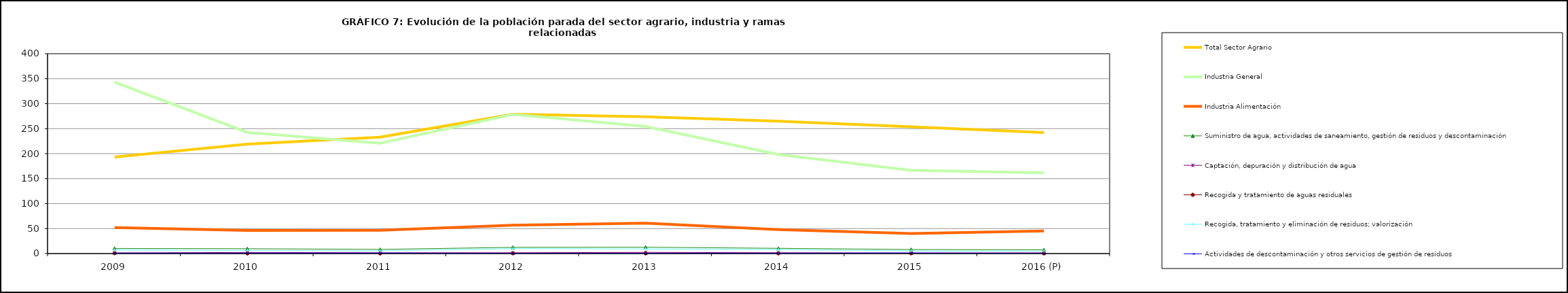
| Category | Total Sector Agrario | Industria General | Industria Alimentación | Suministro de agua, actividades de saneamiento, gestión de residuos y descontaminación  | Captación, depuración y distribución de agua         | Recogida y tratamiento de aguas residuales                                                                                 | Recogida, tratamiento y eliminación de residuos; valorización       | Actividades de descontaminación y otros servicios de gestión de residuos  |
|---|---|---|---|---|---|---|---|---|
| 2009 | 193.25 | 343.025 | 52 | 10.275 | 1.275 | 0.825 | 7.225 | 0.95 |
| 2010 | 218.925 | 242.575 | 46.15 | 9.725 | 2.25 | 0.225 | 6.475 | 0.8 |
| 2011 | 233.075 | 220.925 | 46.525 | 8.375 | 1.675 | 0.325 | 5.45 | 0.85 |
| 2012 | 278.9 | 278.675 | 56.8 | 12.475 | 1.6 | 0.5 | 9.975 | 0.45 |
| 2013 | 273.925 | 254.3 | 60.8 | 12.7 | 2.4 | 0.3 | 9.3 | 0.6 |
| 2014 | 265.1 | 198.3 | 47.85 | 10.5 | 1.6 | 0.4 | 7.9 | 0.8 |
| 2015 | 253.575 | 166.725 | 40.1 | 8.1 | 1.3 | 0.5 | 5.3 | 1 |
| 2016 (P) | 242.2 | 161.6 | 45.23 | 7.6 | 1.5 | 0.3 | 5.1 | 0.5 |